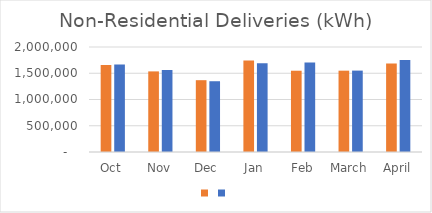
| Category | Series 1 | Series 0 |
|---|---|---|
| Oct | 1657467 | 1665276 |
| Nov | 1535448 | 1561812 |
| Dec | 1367905 | 1348000 |
| Jan | 1741151 | 1691318 |
| Feb | 1548063 | 1705422 |
| March | 1549153 | 1550355 |
| April | 1684677 | 1750598 |